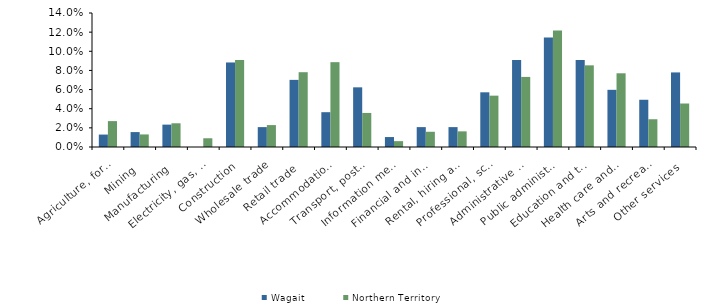
| Category | Wagait | Northern Territory |
|---|---|---|
| Agriculture, forestry and fishing | 0.013 | 0.027 |
| Mining | 0.016 | 0.013 |
| Manufacturing | 0.023 | 0.025 |
| Electricity, gas, water and waste services | 0 | 0.009 |
| Construction | 0.088 | 0.091 |
| Wholesale trade | 0.021 | 0.023 |
| Retail trade | 0.07 | 0.078 |
| Accommodation and food services | 0.036 | 0.089 |
| Transport, postal and warehousing | 0.062 | 0.036 |
| Information media and telecommunications | 0.01 | 0.006 |
| Financial and insurance services | 0.021 | 0.016 |
| Rental, hiring and real estate services | 0.021 | 0.016 |
| Professional, scientific and technical services | 0.057 | 0.054 |
| Administrative and support services | 0.091 | 0.073 |
| Public administration and safety | 0.114 | 0.122 |
| Education and training | 0.091 | 0.085 |
| Health care and social assistance | 0.06 | 0.077 |
| Arts and recreation services | 0.049 | 0.029 |
| Other services | 0.078 | 0.045 |